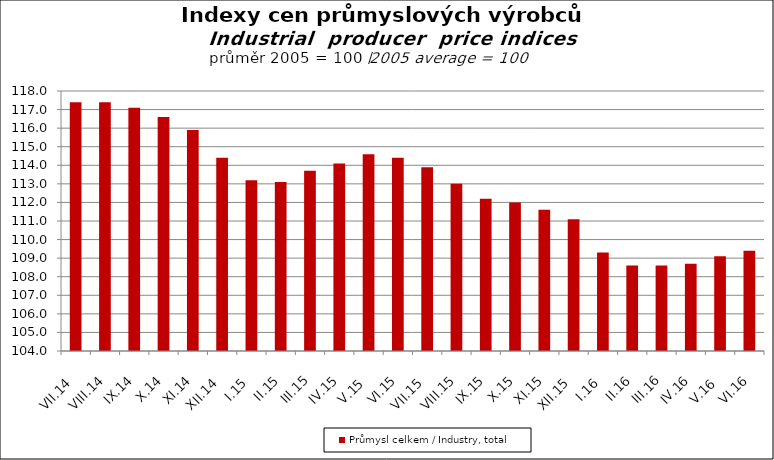
| Category | Průmysl celkem / Industry, total |
|---|---|
| VII.14 | 117.4 |
| VIII.14 | 117.4 |
| IX.14 | 117.1 |
| X.14 | 116.6 |
| XI.14 | 115.9 |
| XII.14 | 114.4 |
| I.15 | 113.2 |
| II.15 | 113.1 |
| III.15 | 113.7 |
| IV.15 | 114.1 |
| V.15 | 114.6 |
| VI.15 | 114.4 |
| VII.15 | 113.9 |
| VIII.15 | 113 |
| IX.15 | 112.2 |
| X.15 | 112 |
| XI.15 | 111.6 |
| XII.15 | 111.1 |
| I.16 | 109.3 |
| II.16 | 108.6 |
| III.16 | 108.6 |
| IV.16 | 108.7 |
| V.16 | 109.1 |
| VI.16 | 109.4 |